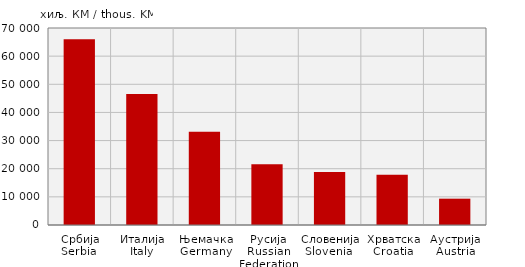
| Category | Увоз
Import |
|---|---|
| Србија
Serbia  | 66027 |
| Италија
Italy | 46579 |
| Њемачка
Germany | 33155 |
| Русија
Russian Federation | 21617 |
| Словенија
Slovenia  | 18822 |
| Хрватска
Croatia | 17891 |
| Аустрија
Austria | 9355 |